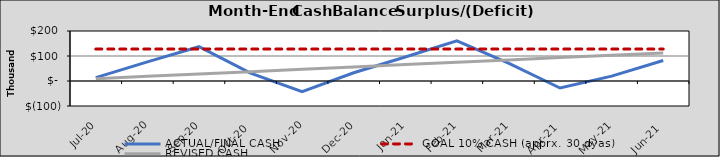
| Category | ACTUAL/FINAL CASH | GOAL 10% CASH (apprx. 30 dyas) | REVISED CASH |
|---|---|---|---|
| 2020-07-01 | 13420.806 | 127916.212 | 9368.558 |
| 2020-08-01 | 76281.612 | 127916.212 | 18737.117 |
| 2020-09-01 | 137217.323 | 127916.212 | 28105.675 |
| 2020-10-02 | 31201.354 | 127916.212 | 37474.233 |
| 2020-11-02 | -42230.46 | 127916.212 | 46842.792 |
| 2020-12-03 | 33020.196 | 127916.212 | 56211.35 |
| 2021-01-03 | 96028.381 | 127916.212 | 65579.908 |
| 2021-02-03 | 160376.562 | 127916.212 | 74948.467 |
| 2021-03-06 | 71749.273 | 127916.212 | 84317.025 |
| 2021-04-06 | -27972.391 | 127916.212 | 93685.583 |
| 2021-05-07 | 19553.555 | 127916.212 | 103054.142 |
| 2021-06-07 | 82017.34 | 127916.212 | 112422.7 |